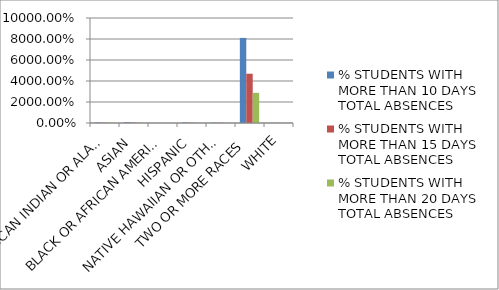
| Category | % STUDENTS WITH MORE THAN 10 DAYS TOTAL ABSENCES | % STUDENTS WITH MORE THAN 15 DAYS TOTAL ABSENCES | % STUDENTS WITH MORE THAN 20 DAYS TOTAL ABSENCES |
|---|---|---|---|
| AMERICAN INDIAN OR ALASKA NATIVE | 0.483 | 0.272 | 0.182 |
| ASIAN | 0.741 | 0.45 | 0.29 |
| BLACK OR AFRICAN AMERICAN | 0.008 | 0.004 | 0.003 |
| HISPANIC | 0.535 | 0.291 | 0.17 |
| NATIVE HAWAIIAN OR OTHER PACIFIC ISLANDER | 0.325 | 0.237 | 0.173 |
| TWO OR MORE RACES | 81.026 | 46.94 | 28.72 |
| WHITE | 0.139 | 0.093 | 0.065 |